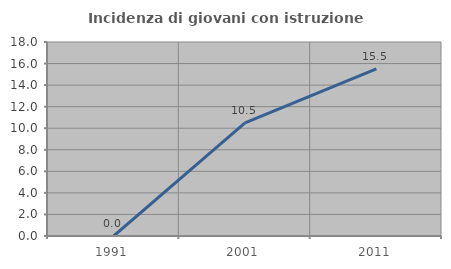
| Category | Incidenza di giovani con istruzione universitaria |
|---|---|
| 1991.0 | 0 |
| 2001.0 | 10.497 |
| 2011.0 | 15.504 |